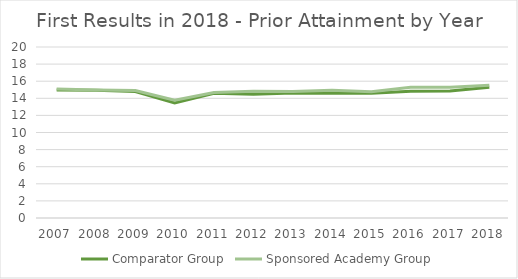
| Category | Comparator Group | Sponsored Academy Group |
|---|---|---|
| 2007.0 | 14.983 | 15.085 |
| 2008.0 | 14.948 | 14.976 |
| 2009.0 | 14.784 | 14.913 |
| 2010.0 | 13.453 | 13.782 |
| 2011.0 | 14.596 | 14.666 |
| 2012.0 | 14.471 | 14.831 |
| 2013.0 | 14.633 | 14.781 |
| 2014.0 | 14.595 | 14.931 |
| 2015.0 | 14.597 | 14.758 |
| 2016.0 | 14.834 | 15.283 |
| 2017.0 | 14.854 | 15.298 |
| 2018.0 | 15.301 | 15.514 |